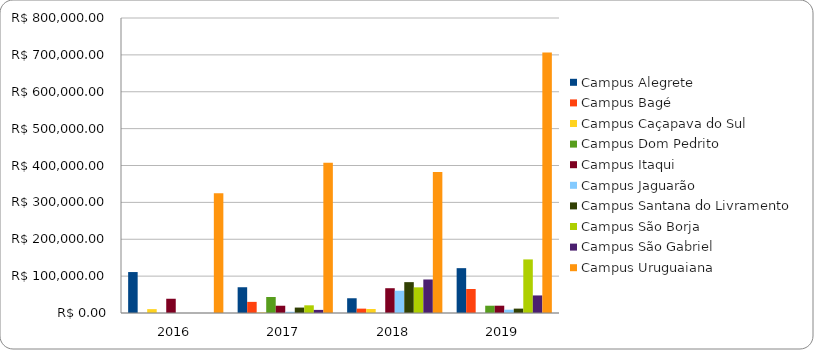
| Category | Campus Alegrete | Campus Bagé | Campus Caçapava do Sul | Campus Dom Pedrito | Campus Itaqui | Campus Jaguarão | Campus Santana do Livramento | Campus São Borja | Campus São Gabriel | Campus Uruguaiana |
|---|---|---|---|---|---|---|---|---|---|---|
| 2016.0 | 111048.91 | 0 | 10487.63 | 0 | 38642.32 | 0 | 0 | 0 | 0 | 324855.82 |
| 2017.0 | 69851.4 | 30177.11 | 1549.5 | 43399 | 19700 | 3345.8 | 14719.2 | 20831.52 | 8427.76 | 407355.82 |
| 2018.0 | 39982.26 | 11850 | 10871.47 | 0 | 67230 | 60387.5 | 83697.56 | 69578.5 | 90874.47 | 382525.44 |
| 2019.0 | 121606 | 65047.5 | 0 | 19766.7 | 19801.64 | 8993.9 | 11892.55 | 145312.99 | 47603.47 | 706682.03 |